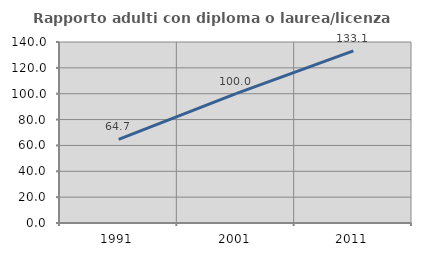
| Category | Rapporto adulti con diploma o laurea/licenza media  |
|---|---|
| 1991.0 | 64.655 |
| 2001.0 | 100 |
| 2011.0 | 133.067 |